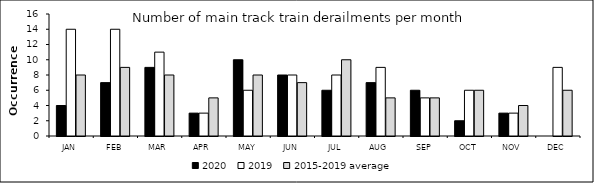
| Category | 2020 | 2019 | 2015-2019 average |
|---|---|---|---|
| JAN | 4 | 14 | 8 |
| FEB | 7 | 14 | 9 |
| MAR | 9 | 11 | 8 |
| APR | 3 | 3 | 5 |
| MAY | 10 | 6 | 8 |
| JUN | 8 | 8 | 7 |
| JUL | 6 | 8 | 10 |
| AUG | 7 | 9 | 5 |
| SEP | 6 | 5 | 5 |
| OCT | 2 | 6 | 6 |
| NOV | 3 | 3 | 4 |
| DEC | 0 | 9 | 6 |